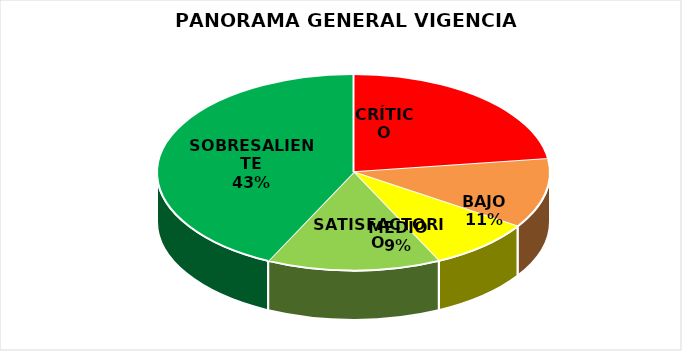
| Category | Series 0 |
|---|---|
| CRÍTICO | 8 |
| BAJO | 4 |
| MEDIO | 3 |
| SATISFACTORIO | 5 |
| SOBRESALIENTE | 15 |